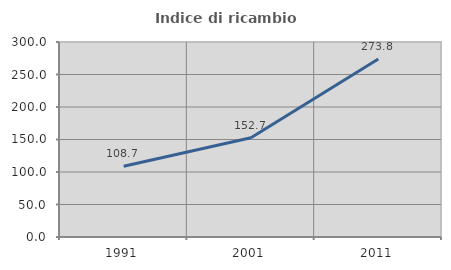
| Category | Indice di ricambio occupazionale  |
|---|---|
| 1991.0 | 108.729 |
| 2001.0 | 152.741 |
| 2011.0 | 273.794 |